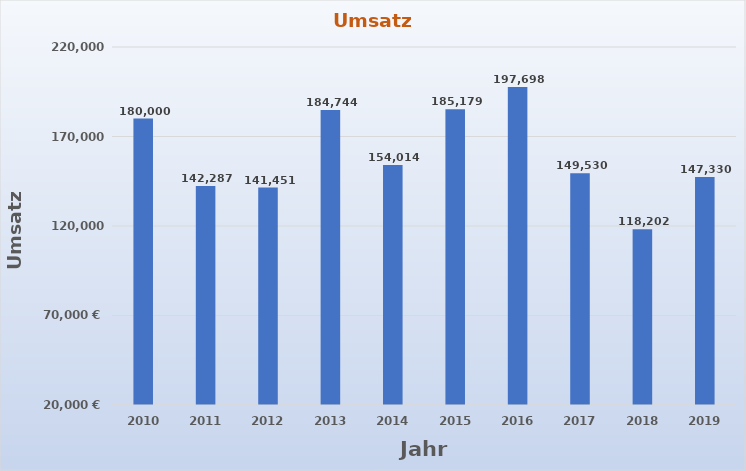
| Category | Umsatz |
|---|---|
| 2010.0 | 180000 |
| 2011.0 | 142287 |
| 2012.0 | 141451 |
| 2013.0 | 184744 |
| 2014.0 | 154014 |
| 2015.0 | 185179 |
| 2016.0 | 197698 |
| 2017.0 | 149530 |
| 2018.0 | 118202 |
| 2019.0 | 147330 |